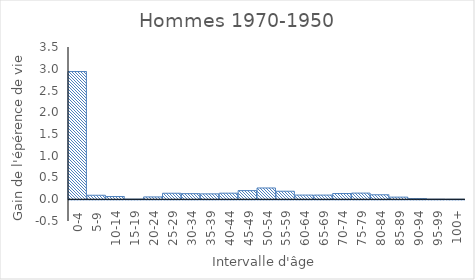
| Category | Hommes |
|---|---|
| 0-4 | 2.936 |
| 5-9 | 0.092 |
| 10-14 | 0.062 |
| 15-19 | 0.002 |
| 20-24 | 0.053 |
| 25-29 | 0.138 |
| 30-34 | 0.129 |
| 35-39 | 0.124 |
| 40-44 | 0.14 |
| 45-49 | 0.199 |
| 50-54 | 0.259 |
| 55-59 | 0.184 |
| 60-64 | 0.096 |
| 65-69 | 0.096 |
| 70-74 | 0.132 |
| 75-79 | 0.142 |
| 80-84 | 0.103 |
| 85-89 | 0.049 |
| 90-94 | 0.014 |
| 95-99 | 0.002 |
| 100+ | 0 |